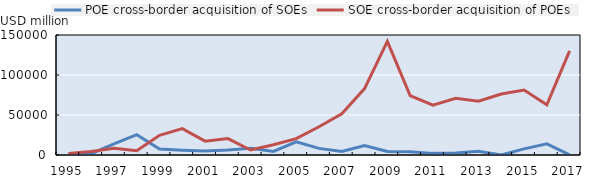
| Category | POE cross-border acquisition of SOEs | SOE cross-border acquisition of POEs |
|---|---|---|
| 1995.0 | 291.75 | 2025.75 |
| 1996.0 | 1569.58 | 4302.9 |
| 1997.0 | 13854.61 | 8342.23 |
| 1998.0 | 25451.2 | 5436.96 |
| 1999.0 | 7413.76 | 24620.93 |
| 2000.0 | 5839.13 | 33022.94 |
| 2001.0 | 4857.32 | 17333.77 |
| 2002.0 | 6195.86 | 20553.29 |
| 2003.0 | 8462.92 | 6261.19 |
| 2004.0 | 4433.39 | 12860.38 |
| 2005.0 | 16519.25 | 20480.91 |
| 2006.0 | 8281.88 | 35274.84 |
| 2007.0 | 4546.61 | 51509.01 |
| 2008.0 | 11693.87 | 83006.38 |
| 2009.0 | 4391.2 | 142073.44 |
| 2010.0 | 4034.18 | 74336.59 |
| 2011.0 | 2033.24 | 62359.29 |
| 2012.0 | 2374.92 | 70903.69 |
| 2013.0 | 4730.25 | 67238.32 |
| 2014.0 | 0 | 76308.19 |
| 2015.0 | 7661.64 | 81150.77 |
| 2016.0 | 14010.78 | 62694.15 |
| 2017.0 | 240.09 | 130052.55 |